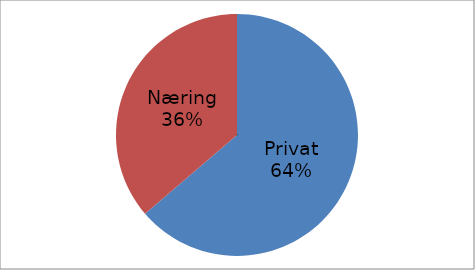
| Category | Series 0 |
|---|---|
| Privat | 35591671 |
| Næring | 20253413 |